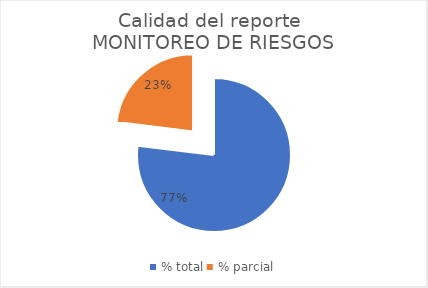
| Category | Series 0 |
|---|---|
| % total | 0.769 |
| % parcial | 0.231 |